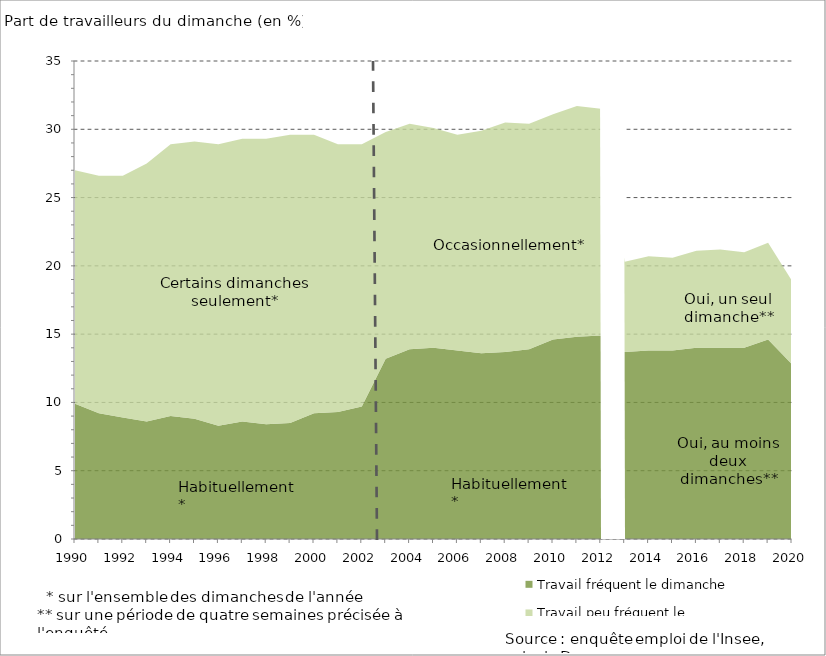
| Category | Travail fréquent le dimanche | Travail peu fréquent le dimanche |
|---|---|---|
| 1990.0 | 9.9 | 17.1 |
| 1991.0 | 9.2 | 17.4 |
| 1992.0 | 8.9 | 17.7 |
| 1993.0 | 8.6 | 18.9 |
| 1994.0 | 9 | 19.9 |
| 1995.0 | 8.8 | 20.3 |
| 1996.0 | 8.3 | 20.6 |
| 1997.0 | 8.6 | 20.7 |
| 1998.0 | 8.4 | 20.9 |
| 1999.0 | 8.5 | 21.1 |
| 2000.0 | 9.2 | 20.4 |
| 2001.0 | 9.3 | 19.6 |
| 2002.0 | 9.7 | 19.2 |
| 2003.0 | 13.2 | 16.6 |
| 2004.0 | 13.9 | 16.5 |
| 2005.0 | 14 | 16.1 |
| 2006.0 | 13.8 | 15.8 |
| 2007.0 | 13.6 | 16.3 |
| 2008.0 | 13.7 | 16.8 |
| 2009.0 | 13.9 | 16.5 |
| 2010.0 | 14.6 | 16.5 |
| 2011.0 | 14.8 | 16.9 |
| 2012.0 | 14.9 | 16.6 |
| 2013.0 | 13.7 | 6.6 |
| 2014.0 | 13.8 | 6.9 |
| 2015.0 | 13.8 | 6.8 |
| 2016.0 | 14 | 7.1 |
| 2017.0 | 14 | 7.2 |
| 2018.0 | 14 | 7 |
| 2019.0 | 14.6 | 7.1 |
| 2020.0 | 12.8 | 6.1 |